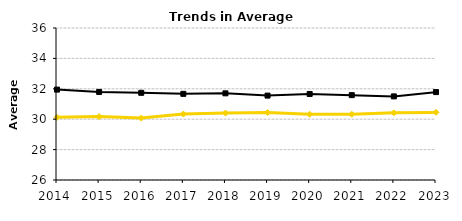
| Category | Graduate | Postgraduate |
|---|---|---|
| 2014.0 | 30.12 | 31.948 |
| 2015.0 | 30.17 | 31.794 |
| 2016.0 | 30.075 | 31.736 |
| 2017.0 | 30.337 | 31.667 |
| 2018.0 | 30.402 | 31.701 |
| 2019.0 | 30.44 | 31.553 |
| 2020.0 | 30.323 | 31.661 |
| 2021.0 | 30.324 | 31.583 |
| 2022.0 | 30.421 | 31.501 |
| 2023.0 | 30.45 | 31.784 |